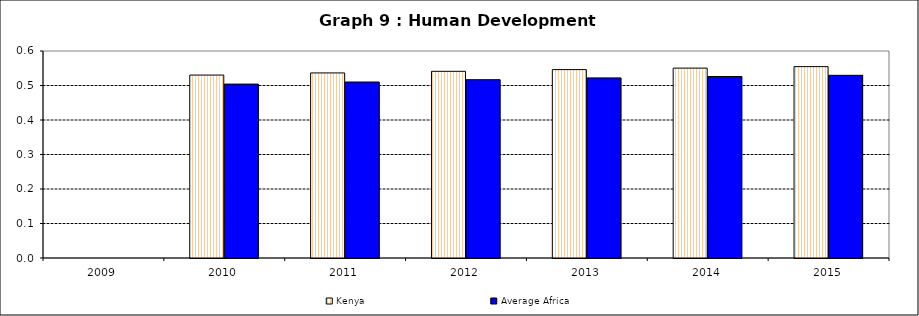
| Category | Kenya | Average Africa |
|---|---|---|
| 2009.0 | 0 | 0 |
| 2010.0 | 0.53 | 0.504 |
| 2011.0 | 0.536 | 0.51 |
| 2012.0 | 0.541 | 0.517 |
| 2013.0 | 0.546 | 0.522 |
| 2014.0 | 0.55 | 0.526 |
| 2015.0 | 0.555 | 0.53 |